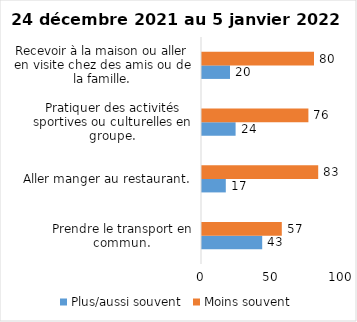
| Category | Plus/aussi souvent | Moins souvent |
|---|---|---|
| Prendre le transport en commun. | 43 | 57 |
| Aller manger au restaurant. | 17 | 83 |
| Pratiquer des activités sportives ou culturelles en groupe. | 24 | 76 |
| Recevoir à la maison ou aller en visite chez des amis ou de la famille. | 20 | 80 |